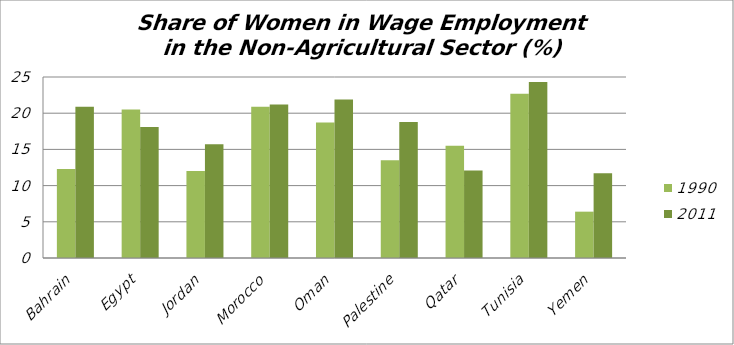
| Category | 1990 | 2011 |
|---|---|---|
| Bahrain | 12.3 | 20.9 |
| Egypt | 20.5 | 18.1 |
| Jordan | 12 | 15.7 |
| Morocco | 20.9 | 21.2 |
| Oman | 18.7 | 21.9 |
| Palestine | 13.5 | 18.8 |
| Qatar | 15.5 | 12.1 |
| Tunisia | 22.7 | 24.3 |
| Yemen | 6.4 | 11.7 |